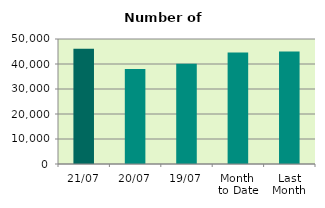
| Category | Series 0 |
|---|---|
| 21/07 | 46066 |
| 20/07 | 38018 |
| 19/07 | 40116 |
| Month 
to Date | 44596.667 |
| Last
Month | 45009.909 |